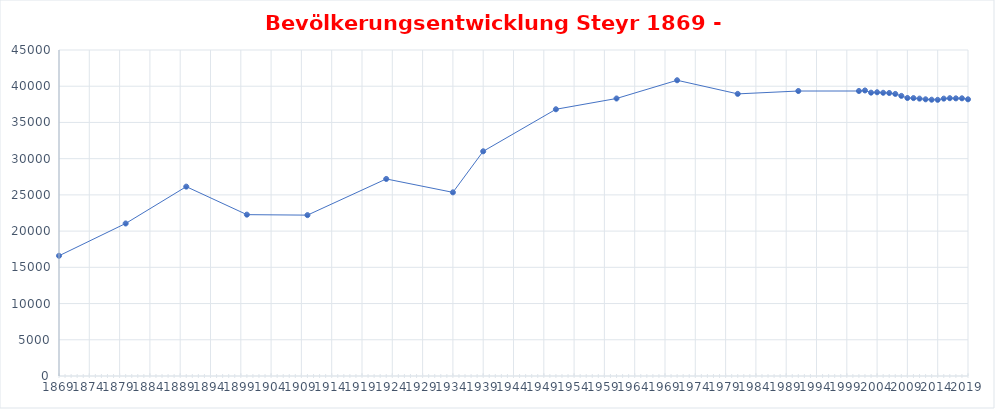
| Category | Bevölkerung |
|---|---|
| 1869.0 | 16593 |
| 1880.0 | 21054 |
| 1890.0 | 26139 |
| 1900.0 | 22272 |
| 1910.0 | 22205 |
| 1923.0 | 27200 |
| 1934.0 | 25351 |
| 1939.0 | 31017 |
| 1951.0 | 36818 |
| 1961.0 | 38306 |
| 1971.0 | 40822 |
| 1981.0 | 38942 |
| 1991.0 | 39337 |
| 2001.0 | 39340 |
| 2002.0 | 39415 |
| 2003.0 | 39111 |
| 2004.0 | 39164 |
| 2005.0 | 39093 |
| 2006.0 | 39064 |
| 2007.0 | 38936 |
| 2008.0 | 38665 |
| 2009.0 | 38374 |
| 2010.0 | 38360 |
| 2011.0 | 38289 |
| 2012.0 | 38193 |
| 2013.0 | 38140 |
| 2014.0 | 38120 |
| 2015.0 | 38287 |
| 2016.0 | 38347 |
| 2017.0 | 38324 |
| 2018.0 | 38331 |
| 2019.0 | 38193 |